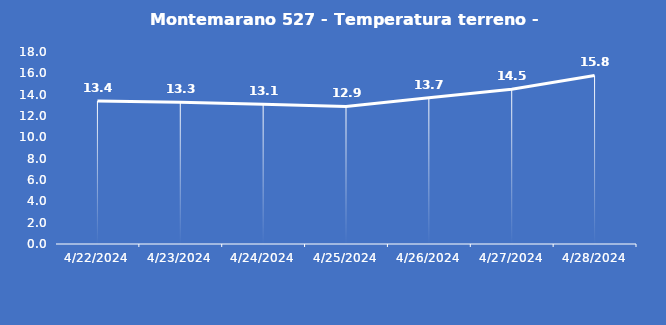
| Category | Montemarano 527 - Temperatura terreno - Grezzo (°C) |
|---|---|
| 4/22/24 | 13.4 |
| 4/23/24 | 13.3 |
| 4/24/24 | 13.1 |
| 4/25/24 | 12.9 |
| 4/26/24 | 13.7 |
| 4/27/24 | 14.5 |
| 4/28/24 | 15.8 |